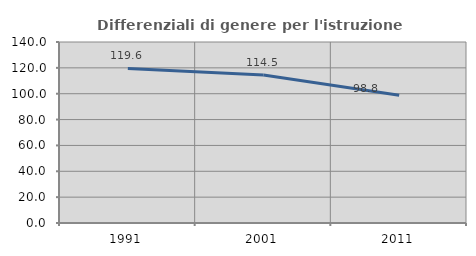
| Category | Differenziali di genere per l'istruzione superiore |
|---|---|
| 1991.0 | 119.566 |
| 2001.0 | 114.532 |
| 2011.0 | 98.822 |